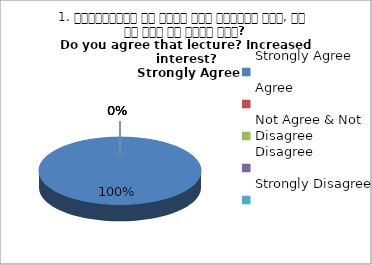
| Category | 1. व्याख्यान से रूचि में वृद्धि हुई, आप इस बात से सहमत हैं?
Do you agree that lecture? Increased interest?
 Strongly Agree |
|---|---|
| Strongly Agree | 1 |
| Agree | 0 |
| Not Agree & Not Disagree | 0 |
| Disagree | 0 |
| Strongly Disagree | 0 |